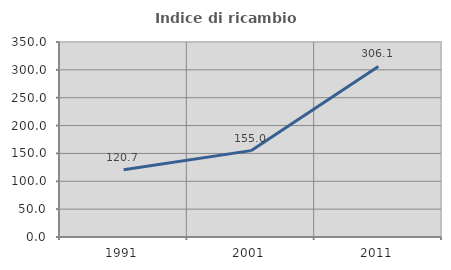
| Category | Indice di ricambio occupazionale  |
|---|---|
| 1991.0 | 120.743 |
| 2001.0 | 155.023 |
| 2011.0 | 306.114 |